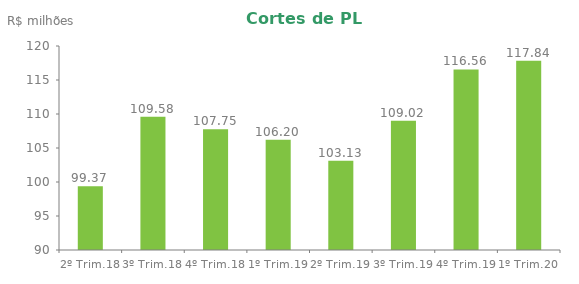
| Category | Series 0 |
|---|---|
| 2º Trim.18 | 99.374 |
| 3º Trim.18 | 109.58 |
| 4º Trim.18 | 107.752 |
| 1º Trim.19 | 106.202 |
| 2º Trim.19 | 103.131 |
| 3º Trim.19 | 109.023 |
| 4º Trim.19 | 116.561 |
| 1º Trim.20 | 117.839 |